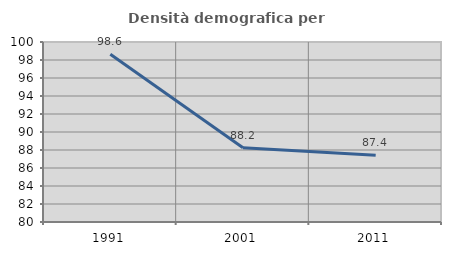
| Category | Densità demografica |
|---|---|
| 1991.0 | 98.646 |
| 2001.0 | 88.246 |
| 2011.0 | 87.422 |